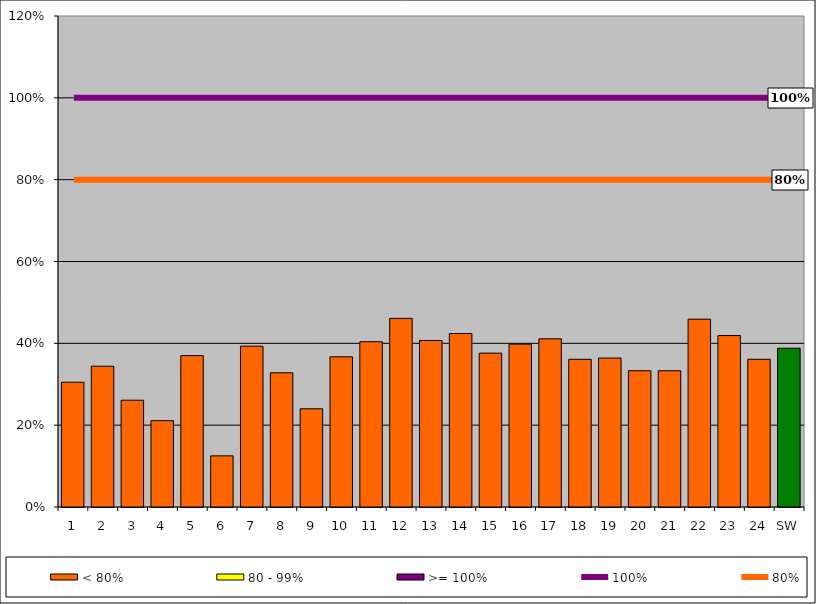
| Category | < 80% | 80 - 99% | >= 100% |
|---|---|---|---|
| 1 | 0.305 | 0 | 0 |
| 2 | 0.344 | 0 | 0 |
| 3 | 0.261 | 0 | 0 |
| 4 | 0.211 | 0 | 0 |
| 5 | 0.37 | 0 | 0 |
| 6 | 0.125 | 0 | 0 |
| 7 | 0.393 | 0 | 0 |
| 8 | 0.328 | 0 | 0 |
| 9 | 0.24 | 0 | 0 |
| 10 | 0.367 | 0 | 0 |
| 11 | 0.404 | 0 | 0 |
| 12 | 0.461 | 0 | 0 |
| 13 | 0.407 | 0 | 0 |
| 14 | 0.424 | 0 | 0 |
| 15 | 0.376 | 0 | 0 |
| 16 | 0.398 | 0 | 0 |
| 17 | 0.411 | 0 | 0 |
| 18 | 0.361 | 0 | 0 |
| 19 | 0.364 | 0 | 0 |
| 20 | 0.333 | 0 | 0 |
| 21 | 0.333 | 0 | 0 |
| 22 | 0.459 | 0 | 0 |
| 23 | 0.419 | 0 | 0 |
| 24 | 0.361 | 0 | 0 |
| SW | 0.388 | 0 | 0 |